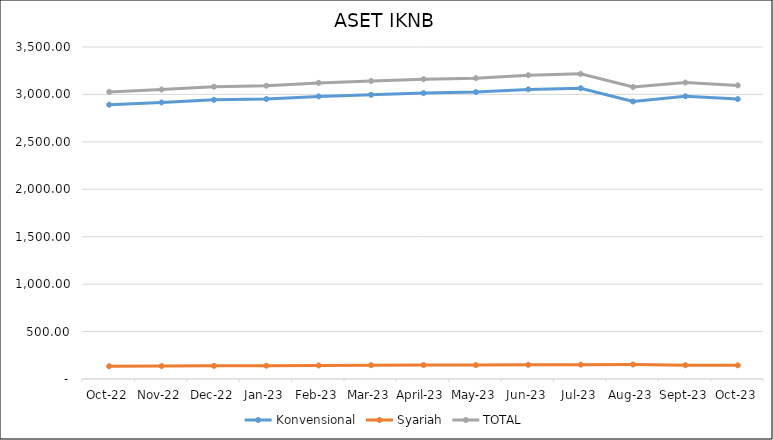
| Category |  Konvensional  |  Syariah  | TOTAL |
|---|---|---|---|
| Oct-22 | 2891.826 | 134.628 | 3026.454 |
| Nov-22 | 2915.393 | 136.376 | 3051.769 |
| Dec-22 | 2942.716 | 138.533 | 3081.249 |
| Jan-23 | 2951.832 | 140.165 | 3091.997 |
| Feb-23 | 2978.913 | 142.696 | 3121.609 |
| Mar-23 | 2995.706 | 146.066 | 3141.772 |
| April-23 | 3013.962 | 147.013 | 3160.975 |
| May-23 | 3025.142 | 146.46 | 3171.602 |
| Jun-23 | 3053.172 | 149.576 | 3202.747 |
| Jul-23 | 3065.53 | 151.21 | 3216.74 |
| Aug-23 | 2925.63 | 152.49 | 3078.12 |
| Sep-23 | 2980.284 | 144.946 | 3125.23 |
| Oct-23 | 2950.911 | 144.2 | 3095.111 |